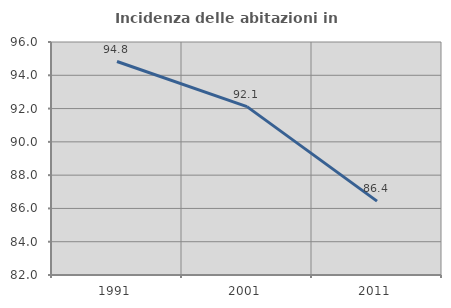
| Category | Incidenza delle abitazioni in proprietà  |
|---|---|
| 1991.0 | 94.828 |
| 2001.0 | 92.116 |
| 2011.0 | 86.441 |